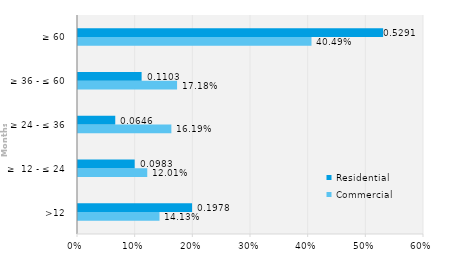
| Category | Commercial | Residential |
|---|---|---|
| >12 | 0.141 | 0.198 |
| ≥  12 - ≤ 24 | 0.12 | 0.098 |
| ≥ 24 - ≤ 36 | 0.162 | 0.065 |
| ≥ 36 - ≤ 60 | 0.172 | 0.11 |
| ≥ 60 | 0.405 | 0.529 |